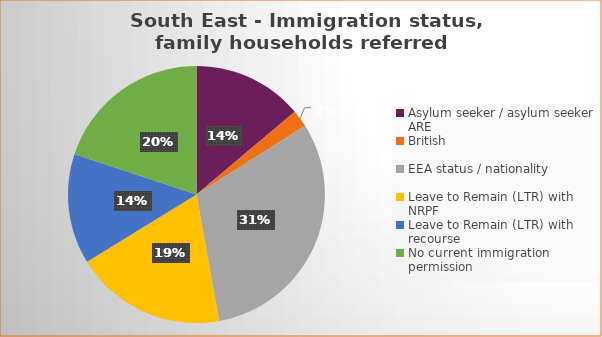
| Category | Number  | Percentage |
|---|---|---|
| Asylum seeker / asylum seeker ARE | 32 | 0.139 |
| British | 5 | 0.022 |
| EEA status / nationality  | 72 | 0.312 |
| Leave to Remain (LTR) with NRPF | 44 | 0.19 |
| Leave to Remain (LTR) with recourse | 32 | 0.139 |
| No current immigration permission | 46 | 0.199 |